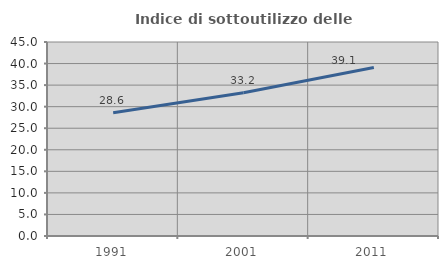
| Category | Indice di sottoutilizzo delle abitazioni  |
|---|---|
| 1991.0 | 28.571 |
| 2001.0 | 33.235 |
| 2011.0 | 39.072 |